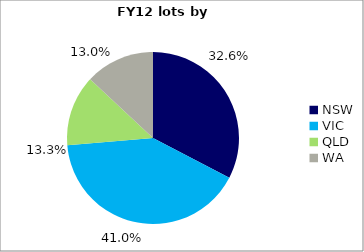
| Category | Series 0 |
|---|---|
| NSW | 0.326 |
| VIC | 0.41 |
| QLD | 0.133 |
| WA | 0.13 |